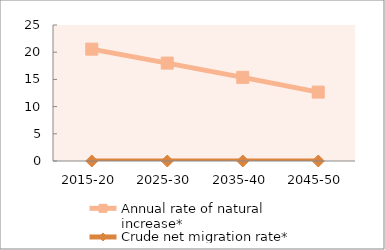
| Category | Annual rate of natural increase* | Crude net migration rate* |
|---|---|---|
| 2015-20 | 20.558 | 0 |
| 2025-30 | 17.999 | 0 |
| 2035-40 | 15.373 | 0 |
| 2045-50 | 12.664 | 0 |